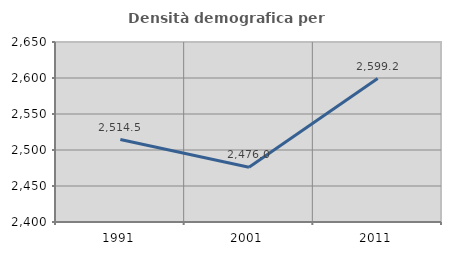
| Category | Densità demografica |
|---|---|
| 1991.0 | 2514.465 |
| 2001.0 | 2476.044 |
| 2011.0 | 2599.2 |